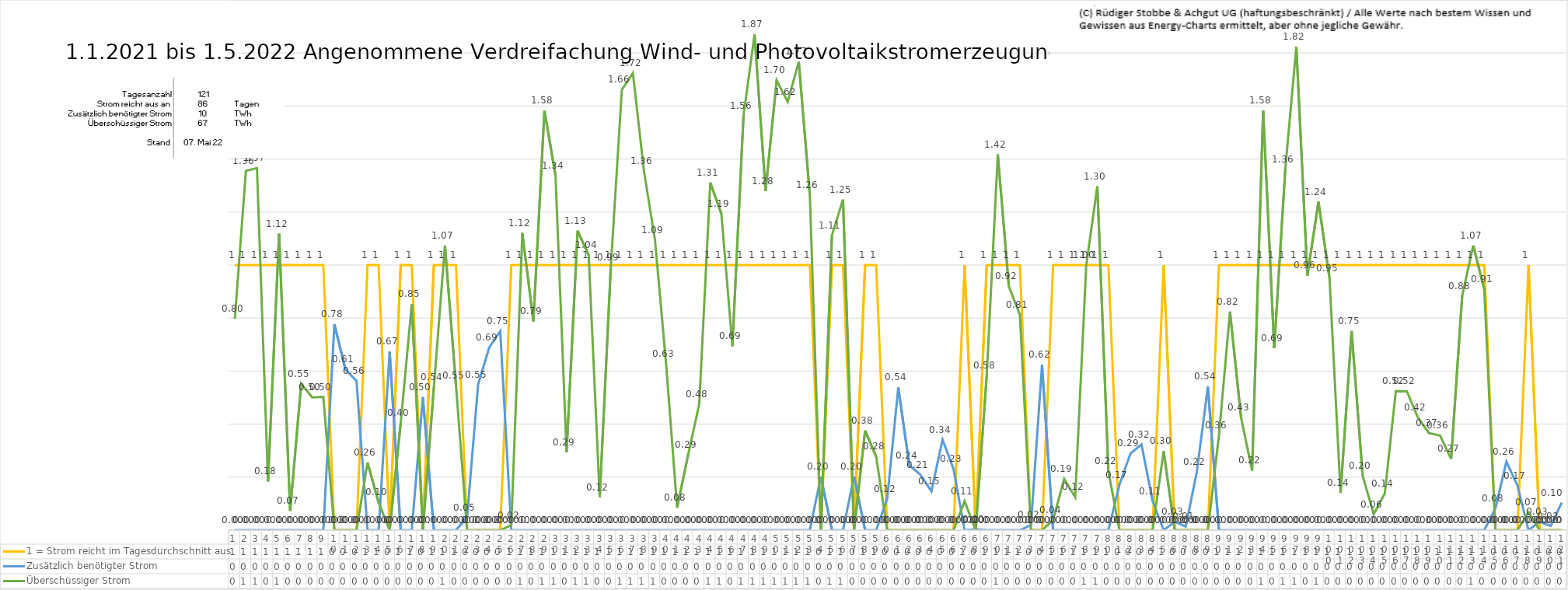
| Category | 1 = Strom reicht im Tagesdurchschnitt aus | Zusätzlich benötigter Strom | Überschüssiger Strom |
|---|---|---|---|
| 0 | 1 | 0 | 0.798 |
| 1 | 1 | 0 | 1.356 |
| 2 | 1 | 0 | 1.366 |
| 3 | 1 | 0 | 0.184 |
| 4 | 1 | 0 | 1.118 |
| 5 | 1 | 0 | 0.073 |
| 6 | 1 | 0 | 0.553 |
| 7 | 1 | 0 | 0.501 |
| 8 | 1 | 0 | 0.503 |
| 9 | 0 | 0.777 | 0 |
| 10 | 0 | 0.606 | 0 |
| 11 | 0 | 0.563 | 0 |
| 12 | 1 | 0 | 0.255 |
| 13 | 1 | 0 | 0.104 |
| 14 | 0 | 0.673 | 0 |
| 15 | 1 | 0 | 0.405 |
| 16 | 1 | 0 | 0.852 |
| 17 | 0 | 0.502 | 0 |
| 18 | 1 | 0 | 0.54 |
| 19 | 1 | 0 | 1.074 |
| 20 | 1 | 0 | 0.546 |
| 21 | 0 | 0.048 | 0 |
| 22 | 0 | 0.55 | 0 |
| 23 | 0 | 0.688 | 0 |
| 24 | 0 | 0.751 | 0 |
| 25 | 1 | 0 | 0.018 |
| 26 | 1 | 0 | 1.121 |
| 27 | 1 | 0 | 0.788 |
| 28 | 1 | 0 | 1.583 |
| 29 | 1 | 0 | 1.338 |
| 30 | 1 | 0 | 0.293 |
| 31 | 1 | 0 | 1.13 |
| 32 | 1 | 0 | 1.037 |
| 33 | 1 | 0 | 0.123 |
| 34 | 1 | 0 | 0.992 |
| 35 | 1 | 0 | 1.662 |
| 36 | 1 | 0 | 1.724 |
| 37 | 1 | 0 | 1.355 |
| 38 | 1 | 0 | 1.094 |
| 39 | 1 | 0 | 0.628 |
| 40 | 1 | 0 | 0.085 |
| 41 | 1 | 0 | 0.286 |
| 42 | 1 | 0 | 0.476 |
| 43 | 1 | 0 | 1.311 |
| 44 | 1 | 0 | 1.194 |
| 45 | 1 | 0 | 0.694 |
| 46 | 1 | 0 | 1.563 |
| 47 | 1 | 0 | 1.87 |
| 48 | 1 | 0 | 1.28 |
| 49 | 1 | 0 | 1.697 |
| 50 | 1 | 0 | 1.616 |
| 51 | 1 | 0 | 1.767 |
| 52 | 1 | 0 | 1.264 |
| 53 | 0 | 0.202 | 0 |
| 54 | 1 | 0 | 1.112 |
| 55 | 1 | 0 | 1.247 |
| 56 | 0 | 0.202 | 0 |
| 57 | 1 | 0 | 0.376 |
| 58 | 1 | 0 | 0.278 |
| 59 | 0 | 0.118 | 0 |
| 60 | 0 | 0.538 | 0 |
| 61 | 0 | 0.244 | 0 |
| 62 | 0 | 0.209 | 0 |
| 63 | 0 | 0.147 | 0 |
| 64 | 0 | 0.341 | 0 |
| 65 | 0 | 0.231 | 0 |
| 66 | 1 | 0 | 0.11 |
| 67 | 0 | 0.003 | 0 |
| 68 | 1 | 0 | 0.584 |
| 69 | 1 | 0 | 1.417 |
| 70 | 1 | 0 | 0.92 |
| 71 | 1 | 0 | 0.813 |
| 72 | 0 | 0.019 | 0 |
| 73 | 0 | 0.624 | 0 |
| 74 | 1 | 0 | 0.038 |
| 75 | 1 | 0 | 0.193 |
| 76 | 1 | 0 | 0.125 |
| 77 | 1 | 0 | 0.999 |
| 78 | 1 | 0 | 1.297 |
| 79 | 1 | 0 | 0.224 |
| 80 | 0 | 0.171 | 0 |
| 81 | 0 | 0.289 | 0 |
| 82 | 0 | 0.323 | 0 |
| 83 | 0 | 0.11 | 0 |
| 84 | 1 | 0 | 0.298 |
| 85 | 0 | 0.032 | 0 |
| 86 | 0 | 0.013 | 0 |
| 87 | 0 | 0.22 | 0 |
| 88 | 0 | 0.541 | 0 |
| 89 | 1 | 0 | 0.357 |
| 90 | 1 | 0 | 0.825 |
| 91 | 1 | 0 | 0.425 |
| 92 | 1 | 0 | 0.225 |
| 93 | 1 | 0 | 1.583 |
| 94 | 1 | 0 | 0.686 |
| 95 | 1 | 0 | 1.361 |
| 96 | 1 | 0 | 1.824 |
| 97 | 1 | 0 | 0.96 |
| 98 | 1 | 0 | 1.239 |
| 99 | 1 | 0 | 0.951 |
| 100 | 1 | 0 | 0.14 |
| 101 | 1 | 0 | 0.751 |
| 102 | 1 | 0 | 0.205 |
| 103 | 1 | 0 | 0.06 |
| 104 | 1 | 0 | 0.138 |
| 105 | 1 | 0 | 0.525 |
| 106 | 1 | 0 | 0.524 |
| 107 | 1 | 0 | 0.425 |
| 108 | 1 | 0 | 0.366 |
| 109 | 1 | 0 | 0.357 |
| 110 | 1 | 0 | 0.269 |
| 111 | 1 | 0 | 0.884 |
| 112 | 1 | 0 | 1.074 |
| 113 | 1 | 0 | 0.908 |
| 114 | 0 | 0.082 | 0 |
| 115 | 0 | 0.258 | 0 |
| 116 | 0 | 0.168 | 0 |
| 117 | 1 | 0 | 0.068 |
| 118 | 0 | 0.031 | 0 |
| 119 | 0 | 0.016 | 0 |
| 120 | 0 | 0.104 | 0 |